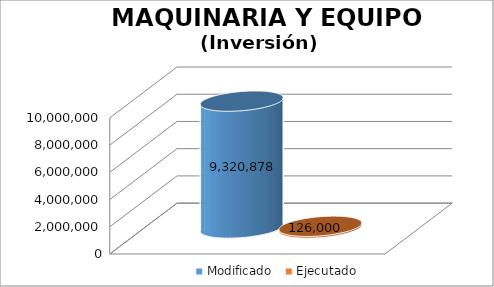
| Category | Modificado | Ejecutado |
|---|---|---|
| 0 | 9320878 | 126000 |